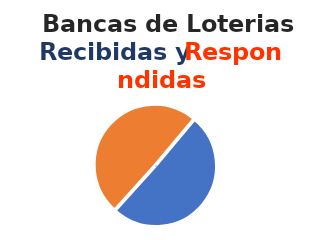
| Category | Series 0 |
|---|---|
| 0 | 132 |
| 1 | 129 |